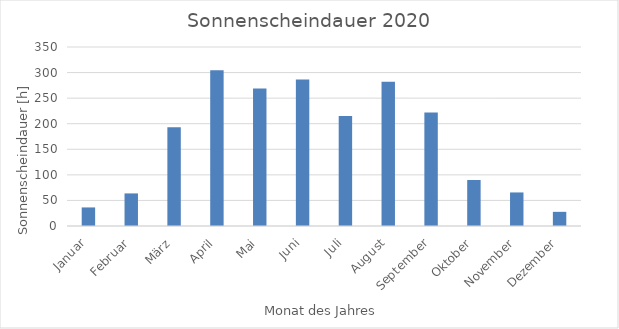
| Category | Series 0 |
|---|---|
| Januar | 36.3 |
| Februar | 63.7 |
| März | 192.9 |
| April | 304.6 |
| Mai | 268.7 |
| Juni | 286.3 |
| Juli | 214.9 |
| August | 282 |
| September | 222 |
| Oktober | 89.9 |
| November | 65.6 |
| Dezember | 27.7 |